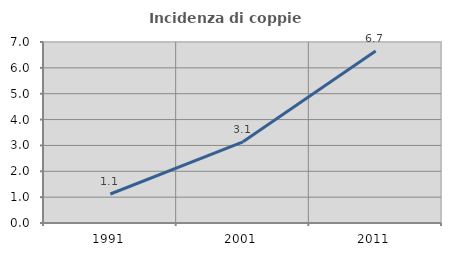
| Category | Incidenza di coppie miste |
|---|---|
| 1991.0 | 1.121 |
| 2001.0 | 3.138 |
| 2011.0 | 6.655 |